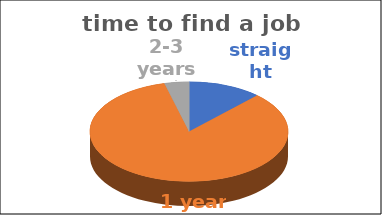
| Category | time to find a job | Series 1 | Series 2 | Series 3 | Series 4 |
|---|---|---|---|---|---|
| straight away | 0.12 |  |  |  |  |
| 1 year | 0.84 |  |  |  |  |
| 2-3 years | 0.04 |  |  |  |  |